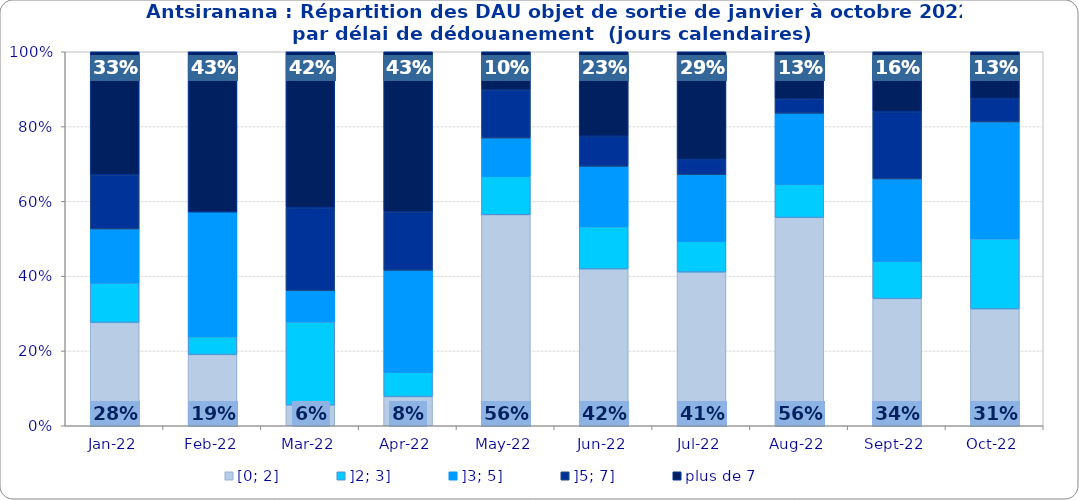
| Category | [0; 2] | ]2; 3] | ]3; 5] | ]5; 7] | plus de 7 |
|---|---|---|---|---|---|
| 2022-01-01 | 0.276 | 0.105 | 0.145 | 0.145 | 0.329 |
| 2022-02-01 | 0.19 | 0.048 | 0.333 | 0 | 0.429 |
| 2022-03-01 | 0.056 | 0.222 | 0.083 | 0.222 | 0.417 |
| 2022-04-01 | 0.078 | 0.065 | 0.273 | 0.156 | 0.429 |
| 2022-05-01 | 0.564 | 0.103 | 0.103 | 0.128 | 0.103 |
| 2022-06-01 | 0.419 | 0.113 | 0.161 | 0.081 | 0.226 |
| 2022-07-01 | 0.411 | 0.082 | 0.178 | 0.041 | 0.288 |
| 2022-08-01 | 0.557 | 0.089 | 0.19 | 0.038 | 0.127 |
| 2022-09-01 | 0.34 | 0.1 | 0.22 | 0.18 | 0.16 |
| 2022-10-01 | 0.312 | 0.188 | 0.312 | 0.062 | 0.125 |